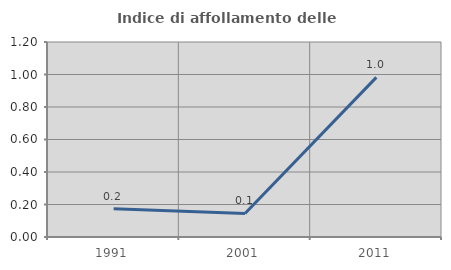
| Category | Indice di affollamento delle abitazioni  |
|---|---|
| 1991.0 | 0.175 |
| 2001.0 | 0.145 |
| 2011.0 | 0.982 |